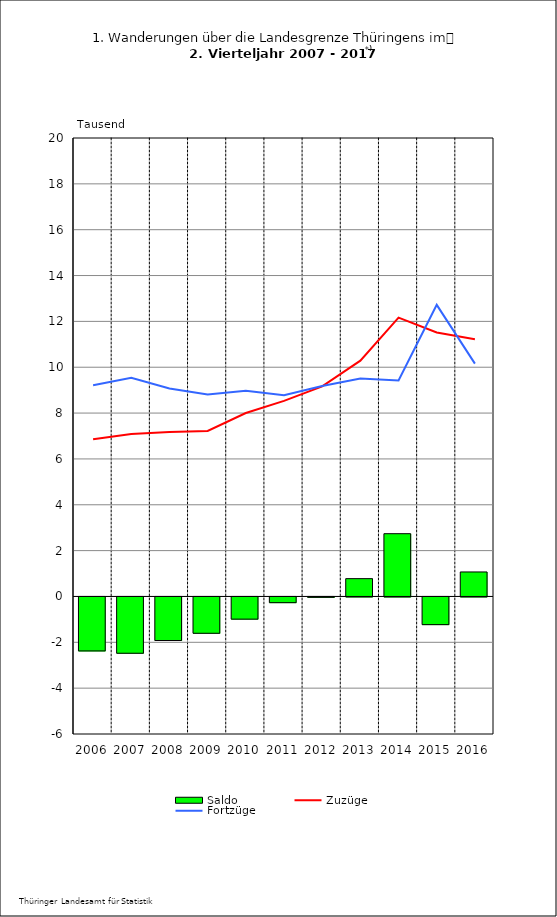
| Category | Saldo |
|---|---|
| 2006.0 | -2.354 |
| 2007.0 | -2.456 |
| 2008.0 | -1.9 |
| 2009.0 | -1.585 |
| 2010.0 | -0.968 |
| 2011.0 | -0.249 |
| 2012.0 | -0.016 |
| 2013.0 | 0.777 |
| 2014.0 | 2.738 |
| 2015.0 | -1.207 |
| 2016.0 | 1.069 |